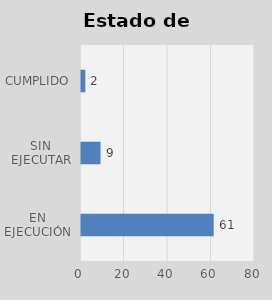
| Category | Total |
|---|---|
| EN EJECUCIÓN | 61 |
| SIN EJECUTAR | 9 |
| CUMPLIDO | 2 |